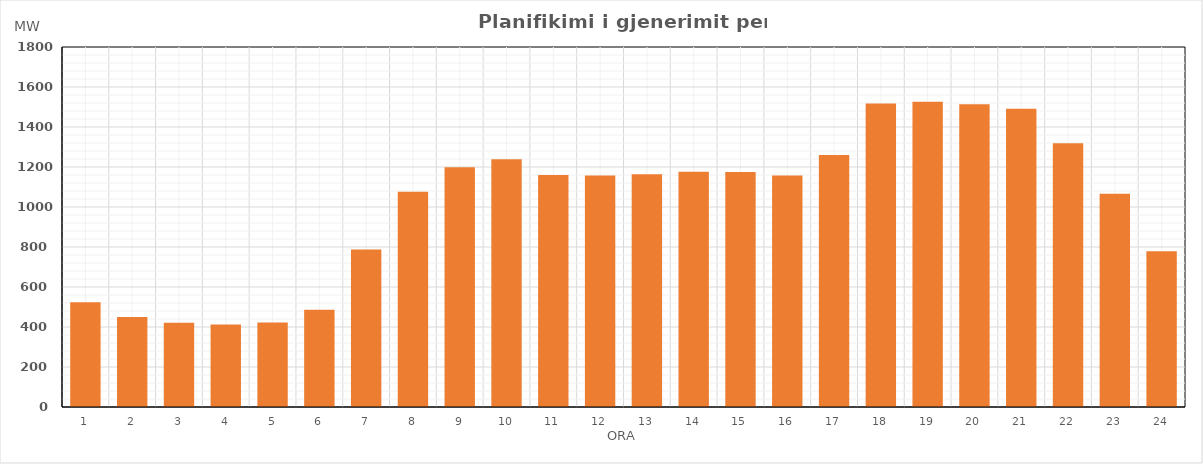
| Category | Max (MW) |
|---|---|
| 0 | 523.435 |
| 1 | 450.08 |
| 2 | 420.995 |
| 3 | 412.915 |
| 4 | 422.045 |
| 5 | 486.27 |
| 6 | 787.18 |
| 7 | 1076.599 |
| 8 | 1199.275 |
| 9 | 1238.415 |
| 10 | 1159.445 |
| 11 | 1157.414 |
| 12 | 1163.349 |
| 13 | 1176.439 |
| 14 | 1174.404 |
| 15 | 1157.319 |
| 16 | 1260.414 |
| 17 | 1516.995 |
| 18 | 1526.225 |
| 19 | 1514.195 |
| 20 | 1491.095 |
| 21 | 1319.22 |
| 22 | 1065.655 |
| 23 | 778.815 |